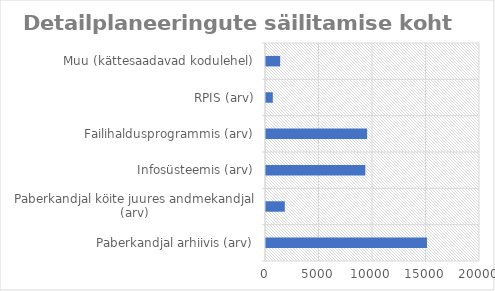
| Category | Series 0 |
|---|---|
| Paberkandjal arhiivis (arv) | 15046 |
| Paberkandjal köite juures andmekandjal (arv) | 1758 |
| Infosüsteemis (arv) | 9279 |
| Failihaldusprogrammis (arv) | 9450 |
| RPIS (arv) | 637 |
| Muu (kättesaadavad kodulehel) | 1324 |